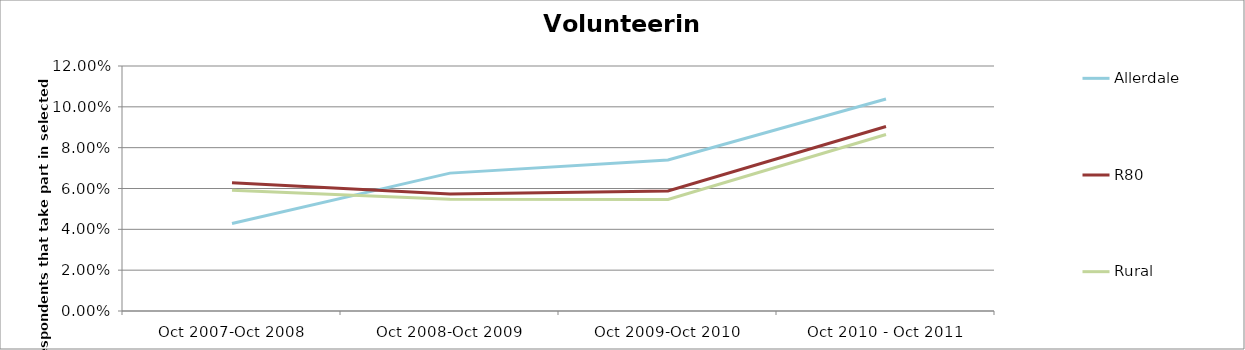
| Category | Allerdale | R80 | Rural |
|---|---|---|---|
| Oct 2007-Oct 2008 | 0.043 | 0.063 | 0.059 |
| Oct 2008-Oct 2009 | 0.068 | 0.057 | 0.055 |
| Oct 2009-Oct 2010 | 0.074 | 0.059 | 0.055 |
| Oct 2010 - Oct 2011 | 0.104 | 0.09 | 0.086 |